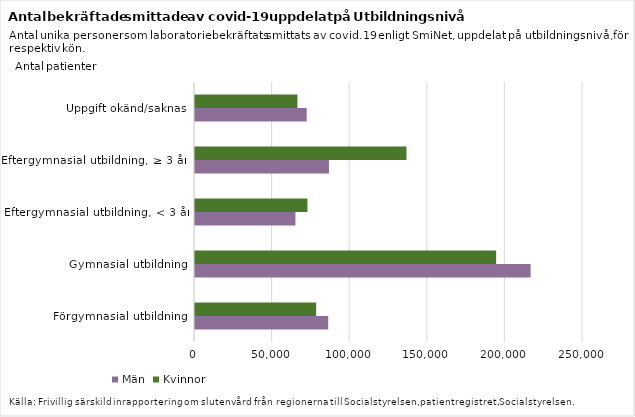
| Category | Män | Kvinnor |
|---|---|---|
| Förgymnasial utbildning | 85810 | 78051 |
| Gymnasial utbildning | 216236 | 194028 |
| Eftergymnasial utbildning, < 3 år | 64704 | 72441 |
| Eftergymnasial utbildning, ≥ 3 år  | 86317 | 136262 |
| Uppgift okänd/saknas | 71970 | 66015 |